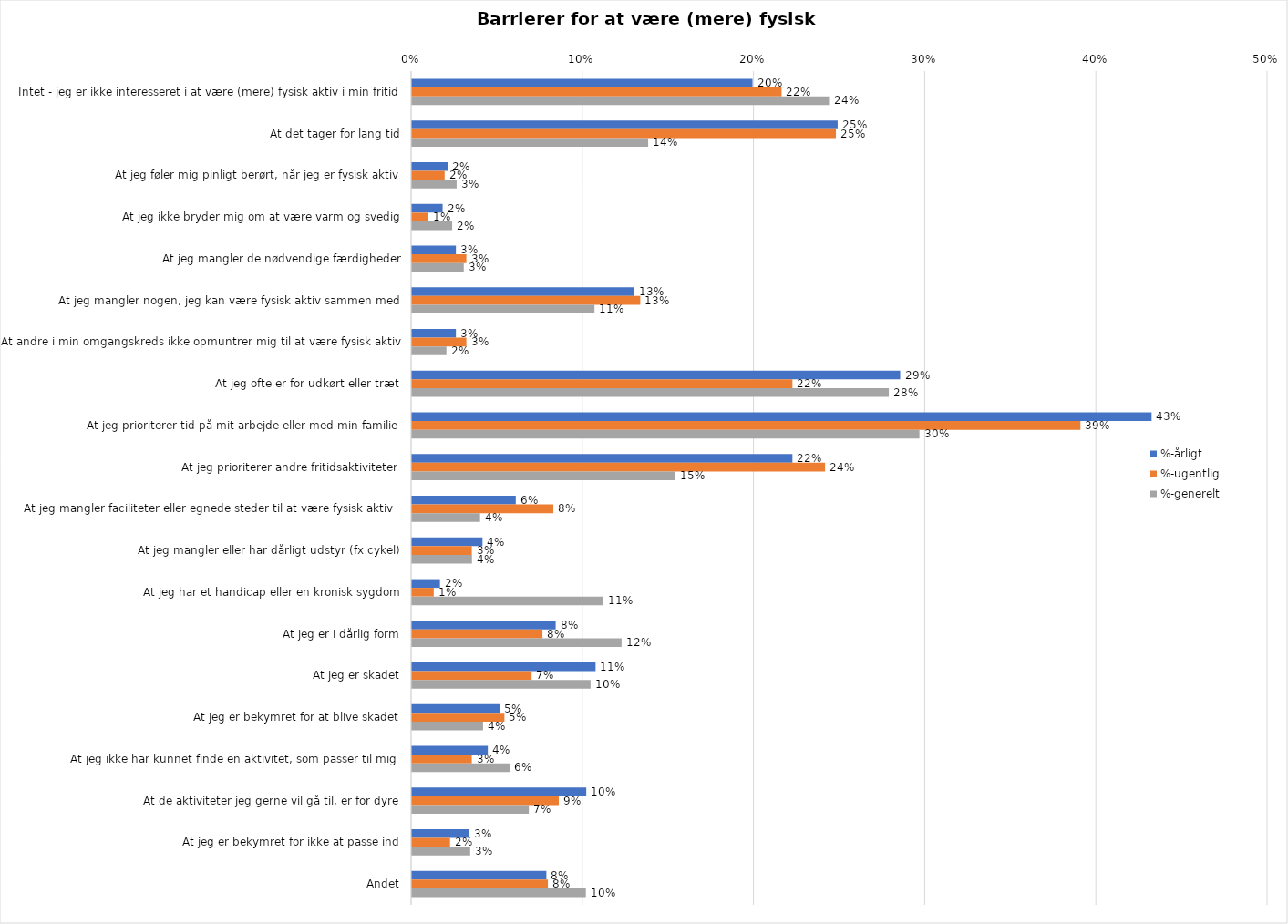
| Category | %-årligt | %-ugentlig | %-generelt |
|---|---|---|---|
| Intet - jeg er ikke interesseret i at være (mere) fysisk aktiv i min fritid | 0.199 | 0.216 | 0.244 |
| At det tager for lang tid | 0.249 | 0.248 | 0.138 |
| At jeg føler mig pinligt berørt, når jeg er fysisk aktiv | 0.021 | 0.019 | 0.026 |
| At jeg ikke bryder mig om at være varm og svedig | 0.018 | 0.01 | 0.023 |
| At jeg mangler de nødvendige færdigheder | 0.026 | 0.032 | 0.03 |
| At jeg mangler nogen, jeg kan være fysisk aktiv sammen med | 0.13 | 0.133 | 0.107 |
| At andre i min omgangskreds ikke opmuntrer mig til at være fysisk aktiv | 0.026 | 0.032 | 0.02 |
| At jeg ofte er for udkørt eller træt | 0.285 | 0.222 | 0.279 |
| At jeg prioriterer tid på mit arbejde eller med min familie | 0.432 | 0.39 | 0.296 |
| At jeg prioriterer andre fritidsaktiviteter | 0.222 | 0.241 | 0.154 |
| At jeg mangler faciliteter eller egnede steder til at være fysisk aktiv  | 0.061 | 0.083 | 0.04 |
| At jeg mangler eller har dårligt udstyr (fx cykel) | 0.041 | 0.035 | 0.035 |
| At jeg har et handicap eller en kronisk sygdom | 0.016 | 0.013 | 0.112 |
| At jeg er i dårlig form | 0.084 | 0.076 | 0.122 |
| At jeg er skadet | 0.107 | 0.07 | 0.104 |
| At jeg er bekymret for at blive skadet | 0.051 | 0.054 | 0.041 |
| At jeg ikke har kunnet finde en aktivitet, som passer til mig  | 0.044 | 0.035 | 0.057 |
| At de aktiviteter jeg gerne vil gå til, er for dyre | 0.102 | 0.086 | 0.068 |
| At jeg er bekymret for ikke at passe ind | 0.033 | 0.022 | 0.034 |
| Andet | 0.078 | 0.079 | 0.102 |